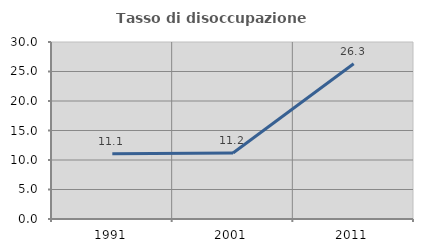
| Category | Tasso di disoccupazione giovanile  |
|---|---|
| 1991.0 | 11.077 |
| 2001.0 | 11.176 |
| 2011.0 | 26.316 |